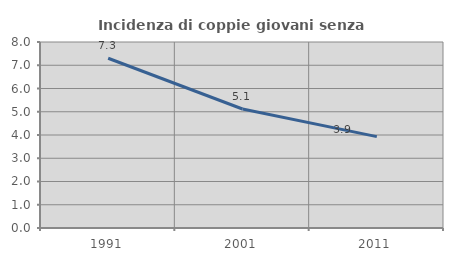
| Category | Incidenza di coppie giovani senza figli |
|---|---|
| 1991.0 | 7.302 |
| 2001.0 | 5.118 |
| 2011.0 | 3.931 |